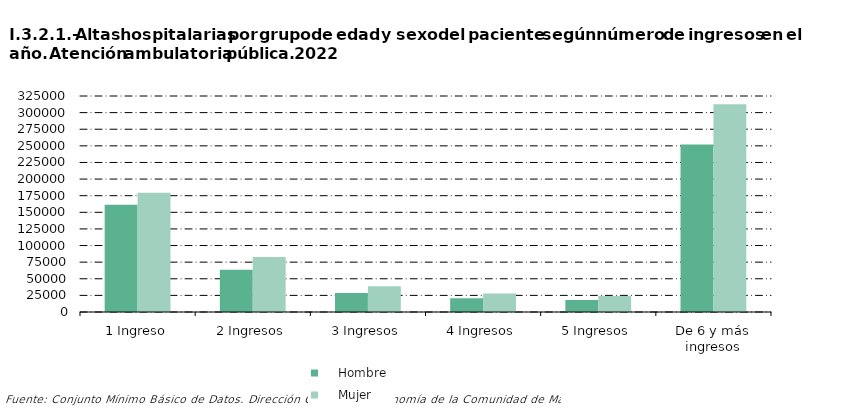
| Category |     Hombre |     Mujer |
|---|---|---|
| 1 Ingreso | 161510 | 179243 |
| 2 Ingresos | 63746 | 82752 |
| 3 Ingresos | 28770 | 38877 |
| 4 Ingresos | 20808 | 27833 |
| 5 Ingresos | 17963 | 24044 |
| De 6 y más ingresos | 252015 | 312537 |